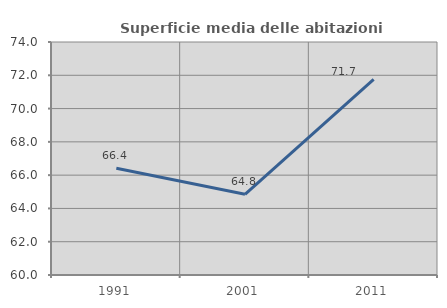
| Category | Superficie media delle abitazioni occupate |
|---|---|
| 1991.0 | 66.419 |
| 2001.0 | 64.849 |
| 2011.0 | 71.748 |